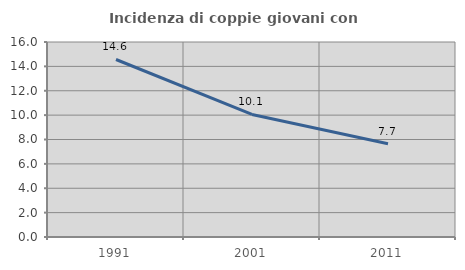
| Category | Incidenza di coppie giovani con figli |
|---|---|
| 1991.0 | 14.565 |
| 2001.0 | 10.054 |
| 2011.0 | 7.657 |